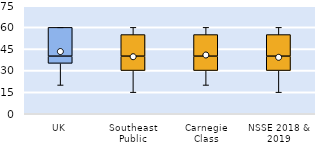
| Category | 25th | 50th | 75th |
|---|---|---|---|
| UK | 35 | 5 | 20 |
| Southeast Public | 30 | 10 | 15 |
| Carnegie Class | 30 | 10 | 15 |
| NSSE 2018 & 2019 | 30 | 10 | 15 |